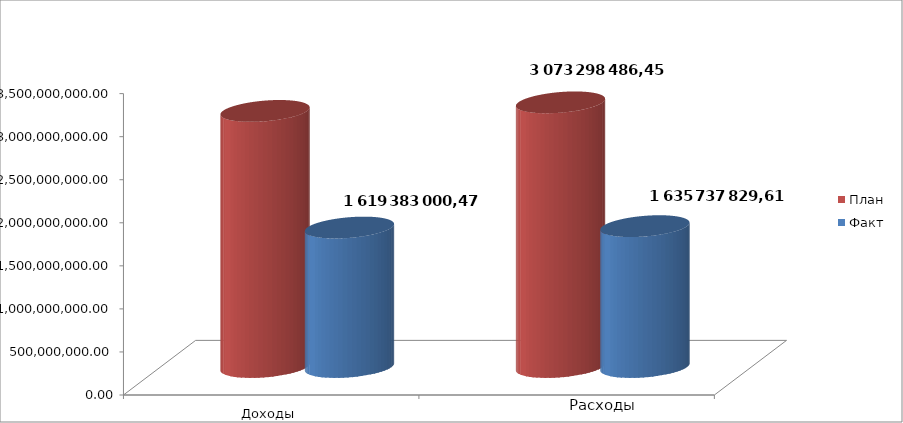
| Category | План | Факт |
|---|---|---|
| 0 | 2973876070.1 | 1619383000.47 |
| 1 | 3073298486.45 | 1635737829.61 |